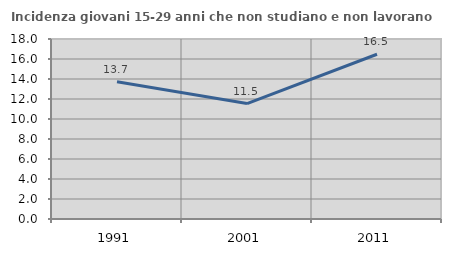
| Category | Incidenza giovani 15-29 anni che non studiano e non lavorano  |
|---|---|
| 1991.0 | 13.725 |
| 2001.0 | 11.544 |
| 2011.0 | 16.474 |